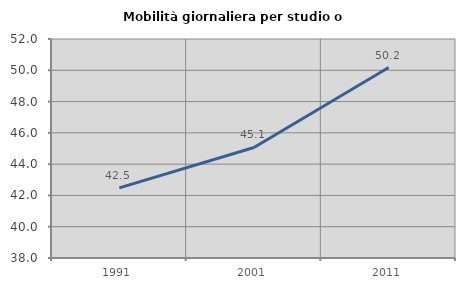
| Category | Mobilità giornaliera per studio o lavoro |
|---|---|
| 1991.0 | 42.484 |
| 2001.0 | 45.065 |
| 2011.0 | 50.174 |